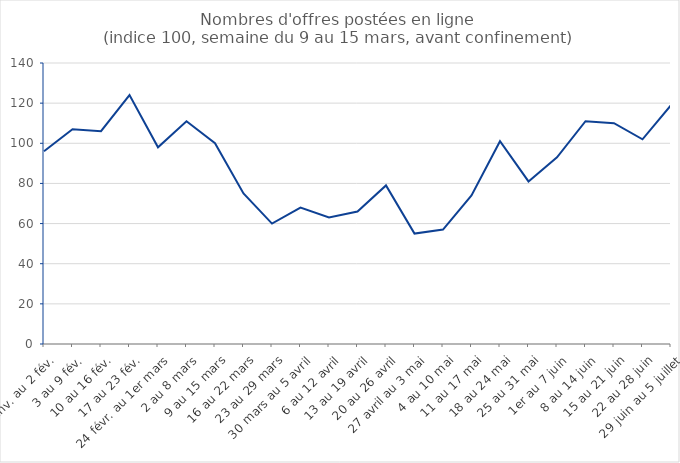
| Category | Series 0 | Series 1 |
|---|---|---|
| 27 janv. au 2 fév. | 96 |  |
| 3 au 9 fév. | 107 |  |
| 10 au 16 fév. | 106 |  |
| 17 au 23 fév. | 124 |  |
| 24 févr. au 1er mars | 98 |  |
| 2 au 8 mars | 111 |  |
| 9 au 15 mars | 100 |  |
| 16 au 22 mars | 75 |  |
| 23 au 29 mars | 60 |  |
| 30 mars au 5 avril | 68 |  |
| 6 au 12 avril | 63 |  |
| 13 au 19 avril | 66 |  |
| 20 au 26 avril | 79 |  |
| 27 avril au 3 mai | 55 |  |
| 4 au 10 mai | 57 |  |
| 11 au 17 mai | 74 |  |
| 18 au 24 mai | 101 |  |
| 25 au 31 mai | 81 |  |
| 1er au 7 juin | 93 |  |
| 8 au 14 juin | 111 |  |
| 15 au 21 juin | 110 |  |
| 22 au 28 juin | 102 |  |
| 29 juin au 5 juillet | 119 |  |